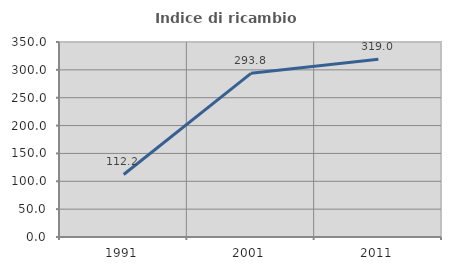
| Category | Indice di ricambio occupazionale  |
|---|---|
| 1991.0 | 112.245 |
| 2001.0 | 293.75 |
| 2011.0 | 318.966 |